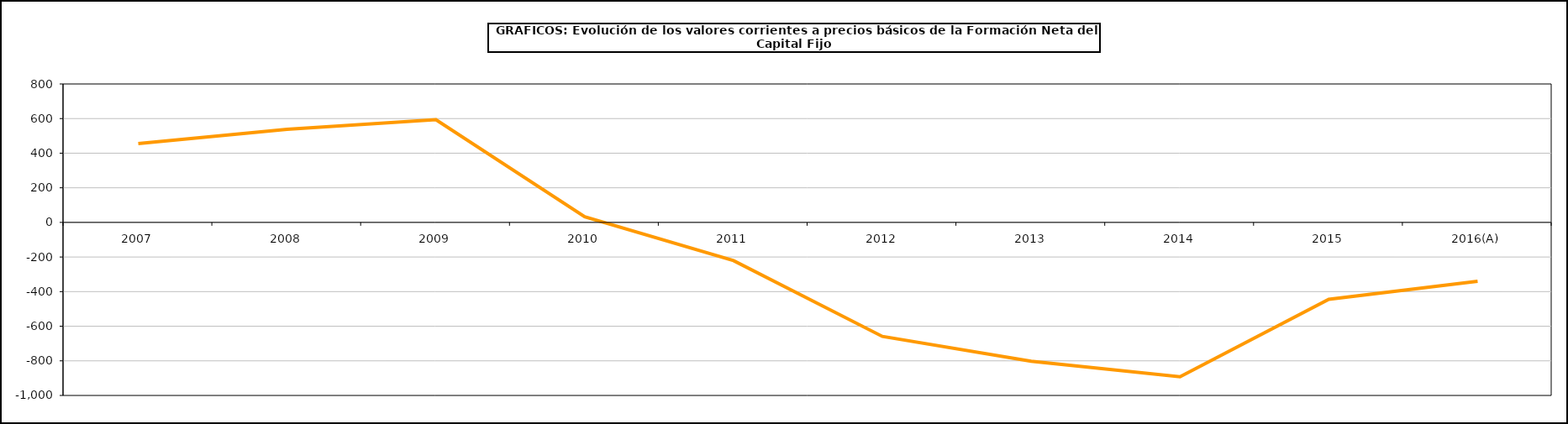
| Category | Formación neta del capital fijo |
|---|---|
| 2007 | 455.747 |
| 2008 | 537.743 |
| 2009 | 594.014 |
| 2010 | 32.826 |
| 2011 | -220.808 |
| 2012 | -658.72 |
| 2013 | -802.263 |
| 2014 | -891.896 |
| 2015 | -444.3 |
| 2016(A) | -340.503 |